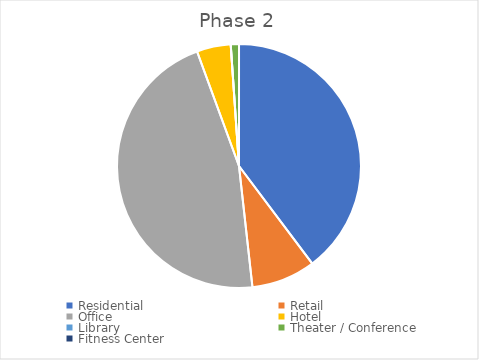
| Category | Series 0 |
|---|---|
| Residential | 0.441 |
| Retail | 0.094 |
| Office | 0.513 |
| Hotel | 0.05 |
| Library | 0 |
| Theater / Conference | 0.012 |
| Fitness Center | 0 |